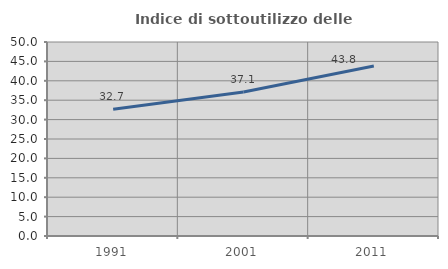
| Category | Indice di sottoutilizzo delle abitazioni  |
|---|---|
| 1991.0 | 32.662 |
| 2001.0 | 37.132 |
| 2011.0 | 43.809 |